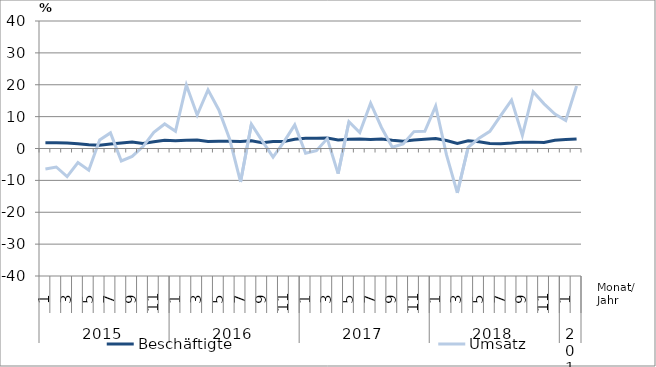
| Category | Beschäftigte | Umsatz |
|---|---|---|
| 0 | 1.8 | -6.4 |
| 1 | 1.8 | -5.8 |
| 2 | 1.7 | -8.8 |
| 3 | 1.5 | -4.4 |
| 4 | 1.2 | -6.8 |
| 5 | 1 | 2.7 |
| 6 | 1.4 | 4.9 |
| 7 | 1.7 | -3.9 |
| 8 | 2 | -2.5 |
| 9 | 1.6 | 0.6 |
| 10 | 2.1 | 5.1 |
| 11 | 2.6 | 7.7 |
| 12 | 2.4 | 5.4 |
| 13 | 2.6 | 19.9 |
| 14 | 2.7 | 10.5 |
| 15 | 2.2 | 18.4 |
| 16 | 2.3 | 12.1 |
| 17 | 2.3 | 2.9 |
| 18 | 2.2 | -10.5 |
| 19 | 2.4 | 7.6 |
| 20 | 1.8 | 2.4 |
| 21 | 2.2 | -2.7 |
| 22 | 2.2 | 2.1 |
| 23 | 2.9 | 7.4 |
| 24 | 3.2 | -1.5 |
| 25 | 3.2 | -0.7 |
| 26 | 3.3 | 3.1 |
| 27 | 2.7 | -7.9 |
| 28 | 2.9 | 8.4 |
| 29 | 3 | 5 |
| 30 | 2.8 | 14.2 |
| 31 | 3 | 6.6 |
| 32 | 2.6 | 0.4 |
| 33 | 2.3 | 1.4 |
| 34 | 2.7 | 5.3 |
| 35 | 2.9 | 5.4 |
| 36 | 3.1 | 13.3 |
| 37 | 2.5 | -2 |
| 38 | 1.6 | -13.9 |
| 39 | 2.4 | 0.4 |
| 40 | 2.1 | 3.2 |
| 41 | 1.6 | 5.4 |
| 42 | 1.5 | 10.3 |
| 43 | 1.7 | 15.2 |
| 44 | 2 | 4.1 |
| 45 | 2 | 17.8 |
| 46 | 1.9 | 14 |
| 47 | 2.6 | 10.8 |
| 48 | 2.8 | 8.8 |
| 49 | 3 | 19.6 |